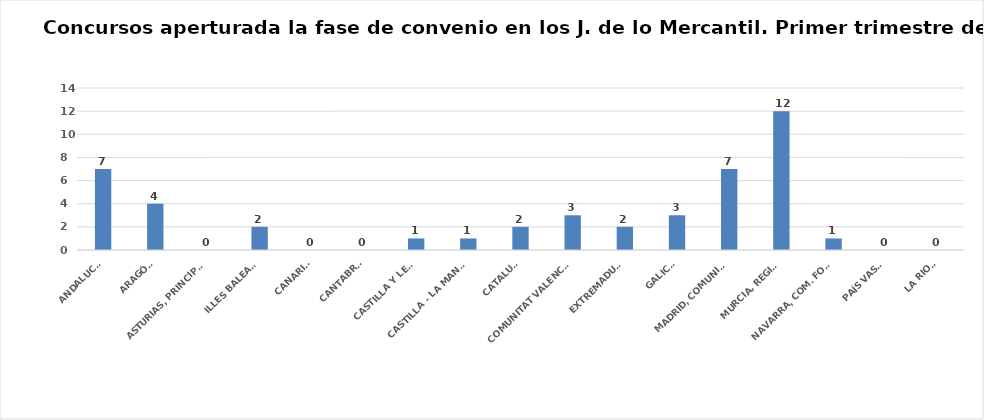
| Category | Series 0 |
|---|---|
| ANDALUCÍA | 7 |
| ARAGÓN | 4 |
| ASTURIAS, PRINCIPADO | 0 |
| ILLES BALEARS | 2 |
| CANARIAS | 0 |
| CANTABRIA | 0 |
| CASTILLA Y LEÓN | 1 |
| CASTILLA - LA MANCHA | 1 |
| CATALUÑA | 2 |
| COMUNITAT VALENCIANA | 3 |
| EXTREMADURA | 2 |
| GALICIA | 3 |
| MADRID, COMUNIDAD | 7 |
| MURCIA, REGIÓN | 12 |
| NAVARRA, COM. FORAL | 1 |
| PAÍS VASCO | 0 |
| LA RIOJA | 0 |